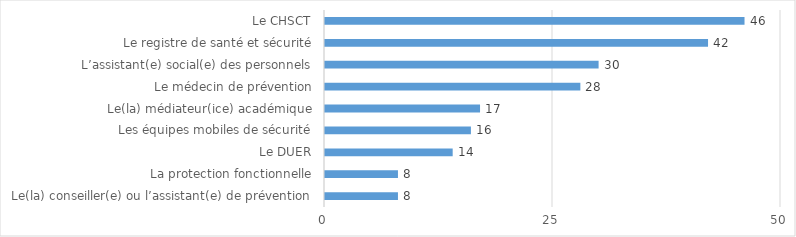
| Category | Personnels déclarant avoir connaissance du dispositif |
|---|---|
| Le(la) conseiller(e) ou l’assistant(e) de prévention | 8 |
| La protection fonctionnelle | 8 |
| Le DUER | 14 |
| Les équipes mobiles de sécurité | 16 |
| Le(la) médiateur(ice) académique | 17 |
| Le médecin de prévention | 28 |
| L’assistant(e) social(e) des personnels | 30 |
| Le registre de santé et sécurité | 42 |
| Le CHSCT | 46 |